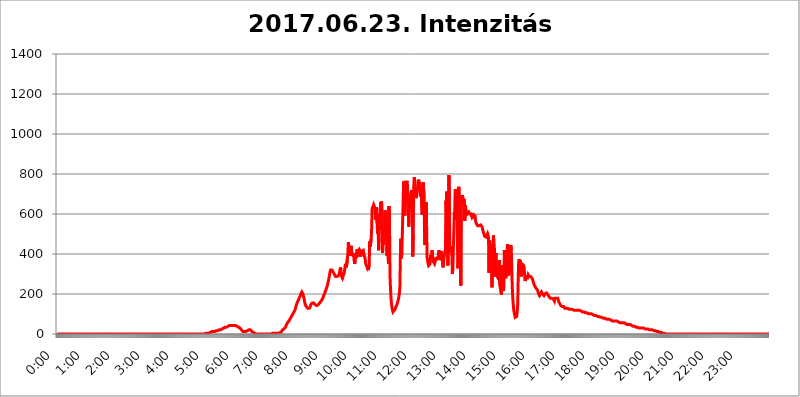
| Category | 2017.06.23. Intenzitás [W/m^2] |
|---|---|
| 0.0 | 0 |
| 0.0006944444444444445 | 0 |
| 0.001388888888888889 | 0 |
| 0.0020833333333333333 | 0 |
| 0.002777777777777778 | 0 |
| 0.003472222222222222 | 0 |
| 0.004166666666666667 | 0 |
| 0.004861111111111111 | 0 |
| 0.005555555555555556 | 0 |
| 0.0062499999999999995 | 0 |
| 0.006944444444444444 | 0 |
| 0.007638888888888889 | 0 |
| 0.008333333333333333 | 0 |
| 0.009027777777777779 | 0 |
| 0.009722222222222222 | 0 |
| 0.010416666666666666 | 0 |
| 0.011111111111111112 | 0 |
| 0.011805555555555555 | 0 |
| 0.012499999999999999 | 0 |
| 0.013194444444444444 | 0 |
| 0.013888888888888888 | 0 |
| 0.014583333333333332 | 0 |
| 0.015277777777777777 | 0 |
| 0.015972222222222224 | 0 |
| 0.016666666666666666 | 0 |
| 0.017361111111111112 | 0 |
| 0.018055555555555557 | 0 |
| 0.01875 | 0 |
| 0.019444444444444445 | 0 |
| 0.02013888888888889 | 0 |
| 0.020833333333333332 | 0 |
| 0.02152777777777778 | 0 |
| 0.022222222222222223 | 0 |
| 0.02291666666666667 | 0 |
| 0.02361111111111111 | 0 |
| 0.024305555555555556 | 0 |
| 0.024999999999999998 | 0 |
| 0.025694444444444447 | 0 |
| 0.02638888888888889 | 0 |
| 0.027083333333333334 | 0 |
| 0.027777777777777776 | 0 |
| 0.02847222222222222 | 0 |
| 0.029166666666666664 | 0 |
| 0.029861111111111113 | 0 |
| 0.030555555555555555 | 0 |
| 0.03125 | 0 |
| 0.03194444444444445 | 0 |
| 0.03263888888888889 | 0 |
| 0.03333333333333333 | 0 |
| 0.034027777777777775 | 0 |
| 0.034722222222222224 | 0 |
| 0.035416666666666666 | 0 |
| 0.036111111111111115 | 0 |
| 0.03680555555555556 | 0 |
| 0.0375 | 0 |
| 0.03819444444444444 | 0 |
| 0.03888888888888889 | 0 |
| 0.03958333333333333 | 0 |
| 0.04027777777777778 | 0 |
| 0.04097222222222222 | 0 |
| 0.041666666666666664 | 0 |
| 0.042361111111111106 | 0 |
| 0.04305555555555556 | 0 |
| 0.043750000000000004 | 0 |
| 0.044444444444444446 | 0 |
| 0.04513888888888889 | 0 |
| 0.04583333333333334 | 0 |
| 0.04652777777777778 | 0 |
| 0.04722222222222222 | 0 |
| 0.04791666666666666 | 0 |
| 0.04861111111111111 | 0 |
| 0.049305555555555554 | 0 |
| 0.049999999999999996 | 0 |
| 0.05069444444444445 | 0 |
| 0.051388888888888894 | 0 |
| 0.052083333333333336 | 0 |
| 0.05277777777777778 | 0 |
| 0.05347222222222222 | 0 |
| 0.05416666666666667 | 0 |
| 0.05486111111111111 | 0 |
| 0.05555555555555555 | 0 |
| 0.05625 | 0 |
| 0.05694444444444444 | 0 |
| 0.057638888888888885 | 0 |
| 0.05833333333333333 | 0 |
| 0.05902777777777778 | 0 |
| 0.059722222222222225 | 0 |
| 0.06041666666666667 | 0 |
| 0.061111111111111116 | 0 |
| 0.06180555555555556 | 0 |
| 0.0625 | 0 |
| 0.06319444444444444 | 0 |
| 0.06388888888888888 | 0 |
| 0.06458333333333334 | 0 |
| 0.06527777777777778 | 0 |
| 0.06597222222222222 | 0 |
| 0.06666666666666667 | 0 |
| 0.06736111111111111 | 0 |
| 0.06805555555555555 | 0 |
| 0.06874999999999999 | 0 |
| 0.06944444444444443 | 0 |
| 0.07013888888888889 | 0 |
| 0.07083333333333333 | 0 |
| 0.07152777777777779 | 0 |
| 0.07222222222222223 | 0 |
| 0.07291666666666667 | 0 |
| 0.07361111111111111 | 0 |
| 0.07430555555555556 | 0 |
| 0.075 | 0 |
| 0.07569444444444444 | 0 |
| 0.0763888888888889 | 0 |
| 0.07708333333333334 | 0 |
| 0.07777777777777778 | 0 |
| 0.07847222222222222 | 0 |
| 0.07916666666666666 | 0 |
| 0.0798611111111111 | 0 |
| 0.08055555555555556 | 0 |
| 0.08125 | 0 |
| 0.08194444444444444 | 0 |
| 0.08263888888888889 | 0 |
| 0.08333333333333333 | 0 |
| 0.08402777777777777 | 0 |
| 0.08472222222222221 | 0 |
| 0.08541666666666665 | 0 |
| 0.08611111111111112 | 0 |
| 0.08680555555555557 | 0 |
| 0.08750000000000001 | 0 |
| 0.08819444444444445 | 0 |
| 0.08888888888888889 | 0 |
| 0.08958333333333333 | 0 |
| 0.09027777777777778 | 0 |
| 0.09097222222222222 | 0 |
| 0.09166666666666667 | 0 |
| 0.09236111111111112 | 0 |
| 0.09305555555555556 | 0 |
| 0.09375 | 0 |
| 0.09444444444444444 | 0 |
| 0.09513888888888888 | 0 |
| 0.09583333333333333 | 0 |
| 0.09652777777777777 | 0 |
| 0.09722222222222222 | 0 |
| 0.09791666666666667 | 0 |
| 0.09861111111111111 | 0 |
| 0.09930555555555555 | 0 |
| 0.09999999999999999 | 0 |
| 0.10069444444444443 | 0 |
| 0.1013888888888889 | 0 |
| 0.10208333333333335 | 0 |
| 0.10277777777777779 | 0 |
| 0.10347222222222223 | 0 |
| 0.10416666666666667 | 0 |
| 0.10486111111111111 | 0 |
| 0.10555555555555556 | 0 |
| 0.10625 | 0 |
| 0.10694444444444444 | 0 |
| 0.1076388888888889 | 0 |
| 0.10833333333333334 | 0 |
| 0.10902777777777778 | 0 |
| 0.10972222222222222 | 0 |
| 0.1111111111111111 | 0 |
| 0.11180555555555556 | 0 |
| 0.11180555555555556 | 0 |
| 0.1125 | 0 |
| 0.11319444444444444 | 0 |
| 0.11388888888888889 | 0 |
| 0.11458333333333333 | 0 |
| 0.11527777777777777 | 0 |
| 0.11597222222222221 | 0 |
| 0.11666666666666665 | 0 |
| 0.1173611111111111 | 0 |
| 0.11805555555555557 | 0 |
| 0.11944444444444445 | 0 |
| 0.12013888888888889 | 0 |
| 0.12083333333333333 | 0 |
| 0.12152777777777778 | 0 |
| 0.12222222222222223 | 0 |
| 0.12291666666666667 | 0 |
| 0.12291666666666667 | 0 |
| 0.12361111111111112 | 0 |
| 0.12430555555555556 | 0 |
| 0.125 | 0 |
| 0.12569444444444444 | 0 |
| 0.12638888888888888 | 0 |
| 0.12708333333333333 | 0 |
| 0.16875 | 0 |
| 0.12847222222222224 | 0 |
| 0.12916666666666668 | 0 |
| 0.12986111111111112 | 0 |
| 0.13055555555555556 | 0 |
| 0.13125 | 0 |
| 0.13194444444444445 | 0 |
| 0.1326388888888889 | 0 |
| 0.13333333333333333 | 0 |
| 0.13402777777777777 | 0 |
| 0.13402777777777777 | 0 |
| 0.13472222222222222 | 0 |
| 0.13541666666666666 | 0 |
| 0.1361111111111111 | 0 |
| 0.13749999999999998 | 0 |
| 0.13819444444444443 | 0 |
| 0.1388888888888889 | 0 |
| 0.13958333333333334 | 0 |
| 0.14027777777777778 | 0 |
| 0.14097222222222222 | 0 |
| 0.14166666666666666 | 0 |
| 0.1423611111111111 | 0 |
| 0.14305555555555557 | 0 |
| 0.14375000000000002 | 0 |
| 0.14444444444444446 | 0 |
| 0.1451388888888889 | 0 |
| 0.1451388888888889 | 0 |
| 0.14652777777777778 | 0 |
| 0.14722222222222223 | 0 |
| 0.14791666666666667 | 0 |
| 0.1486111111111111 | 0 |
| 0.14930555555555555 | 0 |
| 0.15 | 0 |
| 0.15069444444444444 | 0 |
| 0.15138888888888888 | 0 |
| 0.15208333333333332 | 0 |
| 0.15277777777777776 | 0 |
| 0.15347222222222223 | 0 |
| 0.15416666666666667 | 0 |
| 0.15486111111111112 | 0 |
| 0.15555555555555556 | 0 |
| 0.15625 | 0 |
| 0.15694444444444444 | 0 |
| 0.15763888888888888 | 0 |
| 0.15833333333333333 | 0 |
| 0.15902777777777777 | 0 |
| 0.15972222222222224 | 0 |
| 0.16041666666666668 | 0 |
| 0.16111111111111112 | 0 |
| 0.16180555555555556 | 0 |
| 0.1625 | 0 |
| 0.16319444444444445 | 0 |
| 0.1638888888888889 | 0 |
| 0.16458333333333333 | 0 |
| 0.16527777777777777 | 0 |
| 0.16597222222222222 | 0 |
| 0.16666666666666666 | 0 |
| 0.1673611111111111 | 0 |
| 0.16805555555555554 | 0 |
| 0.16874999999999998 | 0 |
| 0.16944444444444443 | 0 |
| 0.17013888888888887 | 0 |
| 0.1708333333333333 | 0 |
| 0.17152777777777775 | 0 |
| 0.17222222222222225 | 0 |
| 0.1729166666666667 | 0 |
| 0.17361111111111113 | 0 |
| 0.17430555555555557 | 0 |
| 0.17500000000000002 | 0 |
| 0.17569444444444446 | 0 |
| 0.1763888888888889 | 0 |
| 0.17708333333333334 | 0 |
| 0.17777777777777778 | 0 |
| 0.17847222222222223 | 0 |
| 0.17916666666666667 | 0 |
| 0.1798611111111111 | 0 |
| 0.18055555555555555 | 0 |
| 0.18125 | 0 |
| 0.18194444444444444 | 0 |
| 0.1826388888888889 | 0 |
| 0.18333333333333335 | 0 |
| 0.1840277777777778 | 0 |
| 0.18472222222222223 | 0 |
| 0.18541666666666667 | 0 |
| 0.18611111111111112 | 0 |
| 0.18680555555555556 | 0 |
| 0.1875 | 0 |
| 0.18819444444444444 | 0 |
| 0.18888888888888888 | 0 |
| 0.18958333333333333 | 0 |
| 0.19027777777777777 | 0 |
| 0.1909722222222222 | 0 |
| 0.19166666666666665 | 0 |
| 0.19236111111111112 | 0 |
| 0.19305555555555554 | 0 |
| 0.19375 | 0 |
| 0.19444444444444445 | 0 |
| 0.1951388888888889 | 0 |
| 0.19583333333333333 | 0 |
| 0.19652777777777777 | 0 |
| 0.19722222222222222 | 0 |
| 0.19791666666666666 | 0 |
| 0.1986111111111111 | 0 |
| 0.19930555555555554 | 0 |
| 0.19999999999999998 | 0 |
| 0.20069444444444443 | 0 |
| 0.20138888888888887 | 0 |
| 0.2020833333333333 | 0 |
| 0.2027777777777778 | 0 |
| 0.2034722222222222 | 0 |
| 0.2041666666666667 | 0 |
| 0.20486111111111113 | 0 |
| 0.20555555555555557 | 0 |
| 0.20625000000000002 | 0 |
| 0.20694444444444446 | 3.525 |
| 0.2076388888888889 | 3.525 |
| 0.20833333333333334 | 3.525 |
| 0.20902777777777778 | 3.525 |
| 0.20972222222222223 | 3.525 |
| 0.21041666666666667 | 3.525 |
| 0.2111111111111111 | 3.525 |
| 0.21180555555555555 | 3.525 |
| 0.2125 | 3.525 |
| 0.21319444444444444 | 7.887 |
| 0.2138888888888889 | 7.887 |
| 0.21458333333333335 | 7.887 |
| 0.2152777777777778 | 7.887 |
| 0.21597222222222223 | 7.887 |
| 0.21666666666666667 | 12.257 |
| 0.21736111111111112 | 12.257 |
| 0.21805555555555556 | 12.257 |
| 0.21875 | 12.257 |
| 0.21944444444444444 | 12.257 |
| 0.22013888888888888 | 12.257 |
| 0.22083333333333333 | 12.257 |
| 0.22152777777777777 | 16.636 |
| 0.2222222222222222 | 16.636 |
| 0.22291666666666665 | 16.636 |
| 0.2236111111111111 | 16.636 |
| 0.22430555555555556 | 16.636 |
| 0.225 | 16.636 |
| 0.22569444444444445 | 16.636 |
| 0.2263888888888889 | 21.024 |
| 0.22708333333333333 | 21.024 |
| 0.22777777777777777 | 21.024 |
| 0.22847222222222222 | 21.024 |
| 0.22916666666666666 | 21.024 |
| 0.2298611111111111 | 25.419 |
| 0.23055555555555554 | 25.419 |
| 0.23124999999999998 | 25.419 |
| 0.23194444444444443 | 29.823 |
| 0.23263888888888887 | 29.823 |
| 0.2333333333333333 | 29.823 |
| 0.2340277777777778 | 29.823 |
| 0.2347222222222222 | 29.823 |
| 0.2354166666666667 | 34.234 |
| 0.23611111111111113 | 34.234 |
| 0.23680555555555557 | 34.234 |
| 0.23750000000000002 | 34.234 |
| 0.23819444444444446 | 38.653 |
| 0.2388888888888889 | 38.653 |
| 0.23958333333333334 | 38.653 |
| 0.24027777777777778 | 38.653 |
| 0.24097222222222223 | 38.653 |
| 0.24166666666666667 | 43.079 |
| 0.2423611111111111 | 43.079 |
| 0.24305555555555555 | 43.079 |
| 0.24375 | 43.079 |
| 0.24444444444444446 | 43.079 |
| 0.24513888888888888 | 43.079 |
| 0.24583333333333335 | 43.079 |
| 0.2465277777777778 | 43.079 |
| 0.24722222222222223 | 43.079 |
| 0.24791666666666667 | 43.079 |
| 0.24861111111111112 | 43.079 |
| 0.24930555555555556 | 43.079 |
| 0.25 | 43.079 |
| 0.25069444444444444 | 43.079 |
| 0.2513888888888889 | 38.653 |
| 0.2520833333333333 | 38.653 |
| 0.25277777777777777 | 38.653 |
| 0.2534722222222222 | 34.234 |
| 0.25416666666666665 | 34.234 |
| 0.2548611111111111 | 34.234 |
| 0.2555555555555556 | 29.823 |
| 0.25625000000000003 | 29.823 |
| 0.2569444444444445 | 29.823 |
| 0.2576388888888889 | 25.419 |
| 0.25833333333333336 | 21.024 |
| 0.2590277777777778 | 21.024 |
| 0.25972222222222224 | 16.636 |
| 0.2604166666666667 | 12.257 |
| 0.2611111111111111 | 12.257 |
| 0.26180555555555557 | 12.257 |
| 0.2625 | 12.257 |
| 0.26319444444444445 | 12.257 |
| 0.2638888888888889 | 12.257 |
| 0.26458333333333334 | 12.257 |
| 0.2652777777777778 | 12.257 |
| 0.2659722222222222 | 12.257 |
| 0.26666666666666666 | 16.636 |
| 0.2673611111111111 | 16.636 |
| 0.26805555555555555 | 21.024 |
| 0.26875 | 21.024 |
| 0.26944444444444443 | 21.024 |
| 0.2701388888888889 | 21.024 |
| 0.2708333333333333 | 21.024 |
| 0.27152777777777776 | 21.024 |
| 0.2722222222222222 | 16.636 |
| 0.27291666666666664 | 12.257 |
| 0.2736111111111111 | 12.257 |
| 0.2743055555555555 | 12.257 |
| 0.27499999999999997 | 7.887 |
| 0.27569444444444446 | 3.525 |
| 0.27638888888888885 | 3.525 |
| 0.27708333333333335 | 3.525 |
| 0.2777777777777778 | 3.525 |
| 0.27847222222222223 | 0 |
| 0.2791666666666667 | 0 |
| 0.2798611111111111 | 0 |
| 0.28055555555555556 | 0 |
| 0.28125 | 0 |
| 0.28194444444444444 | 0 |
| 0.2826388888888889 | 0 |
| 0.2833333333333333 | 0 |
| 0.28402777777777777 | 0 |
| 0.2847222222222222 | 0 |
| 0.28541666666666665 | 0 |
| 0.28611111111111115 | 0 |
| 0.28680555555555554 | 0 |
| 0.28750000000000003 | 0 |
| 0.2881944444444445 | 0 |
| 0.2888888888888889 | 0 |
| 0.28958333333333336 | 0 |
| 0.2902777777777778 | 0 |
| 0.29097222222222224 | 0 |
| 0.2916666666666667 | 0 |
| 0.2923611111111111 | 0 |
| 0.29305555555555557 | 0 |
| 0.29375 | 0 |
| 0.29444444444444445 | 0 |
| 0.2951388888888889 | 0 |
| 0.29583333333333334 | 0 |
| 0.2965277777777778 | 0 |
| 0.2972222222222222 | 0 |
| 0.29791666666666666 | 0 |
| 0.2986111111111111 | 0 |
| 0.29930555555555555 | 0 |
| 0.3 | 0 |
| 0.30069444444444443 | 3.525 |
| 0.3013888888888889 | 3.525 |
| 0.3020833333333333 | 3.525 |
| 0.30277777777777776 | 3.525 |
| 0.3034722222222222 | 0 |
| 0.30416666666666664 | 3.525 |
| 0.3048611111111111 | 3.525 |
| 0.3055555555555555 | 3.525 |
| 0.30624999999999997 | 3.525 |
| 0.3069444444444444 | 3.525 |
| 0.3076388888888889 | 3.525 |
| 0.30833333333333335 | 3.525 |
| 0.3090277777777778 | 3.525 |
| 0.30972222222222223 | 3.525 |
| 0.3104166666666667 | 3.525 |
| 0.3111111111111111 | 3.525 |
| 0.31180555555555556 | 7.887 |
| 0.3125 | 7.887 |
| 0.31319444444444444 | 12.257 |
| 0.3138888888888889 | 12.257 |
| 0.3145833333333333 | 12.257 |
| 0.31527777777777777 | 16.636 |
| 0.3159722222222222 | 21.024 |
| 0.31666666666666665 | 21.024 |
| 0.31736111111111115 | 25.419 |
| 0.31805555555555554 | 25.419 |
| 0.31875000000000003 | 29.823 |
| 0.3194444444444445 | 29.823 |
| 0.3201388888888889 | 34.234 |
| 0.32083333333333336 | 38.653 |
| 0.3215277777777778 | 47.511 |
| 0.32222222222222224 | 51.951 |
| 0.3229166666666667 | 56.398 |
| 0.3236111111111111 | 56.398 |
| 0.32430555555555557 | 60.85 |
| 0.325 | 65.31 |
| 0.32569444444444445 | 69.775 |
| 0.3263888888888889 | 74.246 |
| 0.32708333333333334 | 78.722 |
| 0.3277777777777778 | 83.205 |
| 0.3284722222222222 | 87.692 |
| 0.32916666666666666 | 92.184 |
| 0.3298611111111111 | 96.682 |
| 0.33055555555555555 | 101.184 |
| 0.33125 | 105.69 |
| 0.33194444444444443 | 110.201 |
| 0.3326388888888889 | 114.716 |
| 0.3333333333333333 | 119.235 |
| 0.3340277777777778 | 128.284 |
| 0.3347222222222222 | 137.347 |
| 0.3354166666666667 | 146.423 |
| 0.3361111111111111 | 150.964 |
| 0.3368055555555556 | 160.056 |
| 0.33749999999999997 | 164.605 |
| 0.33819444444444446 | 169.156 |
| 0.33888888888888885 | 173.709 |
| 0.33958333333333335 | 182.82 |
| 0.34027777777777773 | 187.378 |
| 0.34097222222222223 | 191.937 |
| 0.3416666666666666 | 201.058 |
| 0.3423611111111111 | 205.62 |
| 0.3430555555555555 | 210.182 |
| 0.34375 | 210.182 |
| 0.3444444444444445 | 201.058 |
| 0.3451388888888889 | 191.937 |
| 0.3458333333333334 | 182.82 |
| 0.34652777777777777 | 169.156 |
| 0.34722222222222227 | 155.509 |
| 0.34791666666666665 | 146.423 |
| 0.34861111111111115 | 141.884 |
| 0.34930555555555554 | 137.347 |
| 0.35000000000000003 | 132.814 |
| 0.3506944444444444 | 132.814 |
| 0.3513888888888889 | 128.284 |
| 0.3520833333333333 | 128.284 |
| 0.3527777777777778 | 128.284 |
| 0.3534722222222222 | 128.284 |
| 0.3541666666666667 | 132.814 |
| 0.3548611111111111 | 137.347 |
| 0.35555555555555557 | 146.423 |
| 0.35625 | 150.964 |
| 0.35694444444444445 | 150.964 |
| 0.3576388888888889 | 155.509 |
| 0.35833333333333334 | 155.509 |
| 0.3590277777777778 | 155.509 |
| 0.3597222222222222 | 155.509 |
| 0.36041666666666666 | 150.964 |
| 0.3611111111111111 | 150.964 |
| 0.36180555555555555 | 146.423 |
| 0.3625 | 146.423 |
| 0.36319444444444443 | 141.884 |
| 0.3638888888888889 | 141.884 |
| 0.3645833333333333 | 141.884 |
| 0.3652777777777778 | 141.884 |
| 0.3659722222222222 | 146.423 |
| 0.3666666666666667 | 146.423 |
| 0.3673611111111111 | 150.964 |
| 0.3680555555555556 | 155.509 |
| 0.36874999999999997 | 155.509 |
| 0.36944444444444446 | 160.056 |
| 0.37013888888888885 | 164.605 |
| 0.37083333333333335 | 169.156 |
| 0.37152777777777773 | 173.709 |
| 0.37222222222222223 | 178.264 |
| 0.3729166666666666 | 182.82 |
| 0.3736111111111111 | 191.937 |
| 0.3743055555555555 | 191.937 |
| 0.375 | 201.058 |
| 0.3756944444444445 | 210.182 |
| 0.3763888888888889 | 214.746 |
| 0.3770833333333334 | 223.873 |
| 0.37777777777777777 | 228.436 |
| 0.37847222222222227 | 237.564 |
| 0.37916666666666665 | 246.689 |
| 0.37986111111111115 | 260.373 |
| 0.38055555555555554 | 269.49 |
| 0.38125000000000003 | 283.156 |
| 0.3819444444444444 | 296.808 |
| 0.3826388888888889 | 310.44 |
| 0.3833333333333333 | 319.517 |
| 0.3840277777777778 | 314.98 |
| 0.3847222222222222 | 314.98 |
| 0.3854166666666667 | 319.517 |
| 0.3861111111111111 | 314.98 |
| 0.38680555555555557 | 310.44 |
| 0.3875 | 305.898 |
| 0.38819444444444445 | 301.354 |
| 0.3888888888888889 | 296.808 |
| 0.38958333333333334 | 296.808 |
| 0.3902777777777778 | 287.709 |
| 0.3909722222222222 | 287.709 |
| 0.39166666666666666 | 287.709 |
| 0.3923611111111111 | 287.709 |
| 0.39305555555555555 | 283.156 |
| 0.39375 | 287.709 |
| 0.39444444444444443 | 292.259 |
| 0.3951388888888889 | 296.808 |
| 0.3958333333333333 | 305.898 |
| 0.3965277777777778 | 319.517 |
| 0.3972222222222222 | 333.113 |
| 0.3979166666666667 | 319.517 |
| 0.3986111111111111 | 287.709 |
| 0.3993055555555556 | 287.709 |
| 0.39999999999999997 | 278.603 |
| 0.40069444444444446 | 287.709 |
| 0.40138888888888885 | 283.156 |
| 0.40208333333333335 | 301.354 |
| 0.40277777777777773 | 310.44 |
| 0.40347222222222223 | 333.113 |
| 0.4041666666666666 | 351.198 |
| 0.4048611111111111 | 342.162 |
| 0.4055555555555555 | 333.113 |
| 0.40625 | 333.113 |
| 0.4069444444444445 | 378.224 |
| 0.4076388888888889 | 405.108 |
| 0.4083333333333334 | 458.38 |
| 0.40902777777777777 | 462.786 |
| 0.40972222222222227 | 418.492 |
| 0.41041666666666665 | 391.685 |
| 0.41111111111111115 | 387.202 |
| 0.41180555555555554 | 422.943 |
| 0.41250000000000003 | 440.702 |
| 0.4131944444444444 | 391.685 |
| 0.4138888888888889 | 405.108 |
| 0.4145833333333333 | 396.164 |
| 0.4152777777777778 | 387.202 |
| 0.4159722222222222 | 405.108 |
| 0.4166666666666667 | 364.728 |
| 0.4173611111111111 | 351.198 |
| 0.41805555555555557 | 400.638 |
| 0.41875 | 378.224 |
| 0.41944444444444445 | 382.715 |
| 0.4201388888888889 | 373.729 |
| 0.42083333333333334 | 422.943 |
| 0.4215277777777778 | 387.202 |
| 0.4222222222222222 | 414.035 |
| 0.42291666666666666 | 409.574 |
| 0.4236111111111111 | 422.943 |
| 0.42430555555555555 | 418.492 |
| 0.425 | 414.035 |
| 0.42569444444444443 | 387.202 |
| 0.4263888888888889 | 400.638 |
| 0.4270833333333333 | 414.035 |
| 0.4277777777777778 | 409.574 |
| 0.4284722222222222 | 409.574 |
| 0.4291666666666667 | 418.492 |
| 0.4298611111111111 | 405.108 |
| 0.4305555555555556 | 409.574 |
| 0.43124999999999997 | 405.108 |
| 0.43194444444444446 | 373.729 |
| 0.43263888888888885 | 351.198 |
| 0.43333333333333335 | 351.198 |
| 0.43402777777777773 | 355.712 |
| 0.43472222222222223 | 333.113 |
| 0.4354166666666666 | 342.162 |
| 0.4361111111111111 | 319.517 |
| 0.4368055555555555 | 314.98 |
| 0.4375 | 342.162 |
| 0.4381944444444445 | 462.786 |
| 0.4388888888888889 | 436.27 |
| 0.4395833333333334 | 436.27 |
| 0.44027777777777777 | 475.972 |
| 0.44097222222222227 | 528.2 |
| 0.44166666666666665 | 629.948 |
| 0.44236111111111115 | 634.105 |
| 0.44305555555555554 | 638.256 |
| 0.44375000000000003 | 646.537 |
| 0.4444444444444444 | 642.4 |
| 0.4451388888888889 | 634.105 |
| 0.4458333333333333 | 625.784 |
| 0.4465277777777778 | 571.049 |
| 0.4472222222222222 | 625.784 |
| 0.4479166666666667 | 634.105 |
| 0.4486111111111111 | 553.986 |
| 0.44930555555555557 | 502.192 |
| 0.45 | 600.661 |
| 0.45069444444444445 | 418.492 |
| 0.4513888888888889 | 484.735 |
| 0.45208333333333334 | 575.299 |
| 0.4527777777777778 | 523.88 |
| 0.4534722222222222 | 658.909 |
| 0.45416666666666666 | 600.661 |
| 0.4548611111111111 | 663.019 |
| 0.45555555555555555 | 575.299 |
| 0.45625 | 405.108 |
| 0.45694444444444443 | 467.187 |
| 0.4576388888888889 | 445.129 |
| 0.4583333333333333 | 528.2 |
| 0.4590277777777778 | 506.542 |
| 0.4597222222222222 | 617.436 |
| 0.4604166666666667 | 613.252 |
| 0.4611111111111111 | 596.45 |
| 0.4618055555555556 | 596.45 |
| 0.46249999999999997 | 391.685 |
| 0.46319444444444446 | 566.793 |
| 0.46388888888888885 | 391.685 |
| 0.46458333333333335 | 351.198 |
| 0.46527777777777773 | 638.256 |
| 0.46597222222222223 | 566.793 |
| 0.4666666666666666 | 296.808 |
| 0.4673611111111111 | 228.436 |
| 0.4680555555555555 | 182.82 |
| 0.46875 | 150.964 |
| 0.4694444444444445 | 132.814 |
| 0.4701388888888889 | 119.235 |
| 0.4708333333333334 | 110.201 |
| 0.47152777777777777 | 110.201 |
| 0.47222222222222227 | 114.716 |
| 0.47291666666666665 | 119.235 |
| 0.47361111111111115 | 123.758 |
| 0.47430555555555554 | 128.284 |
| 0.47500000000000003 | 137.347 |
| 0.4756944444444444 | 141.884 |
| 0.4763888888888889 | 146.423 |
| 0.4770833333333333 | 155.509 |
| 0.4777777777777778 | 164.605 |
| 0.4784722222222222 | 173.709 |
| 0.4791666666666667 | 187.378 |
| 0.4798611111111111 | 205.62 |
| 0.48055555555555557 | 237.564 |
| 0.48125 | 396.164 |
| 0.48194444444444445 | 475.972 |
| 0.4826388888888889 | 378.224 |
| 0.48333333333333334 | 409.574 |
| 0.4840277777777778 | 502.192 |
| 0.4847222222222222 | 609.062 |
| 0.48541666666666666 | 707.8 |
| 0.4861111111111111 | 763.674 |
| 0.48680555555555555 | 759.723 |
| 0.4875 | 592.233 |
| 0.48819444444444443 | 743.859 |
| 0.4888888888888889 | 759.723 |
| 0.4895833333333333 | 759.723 |
| 0.4902777777777778 | 755.766 |
| 0.4909722222222222 | 759.723 |
| 0.4916666666666667 | 683.473 |
| 0.4923611111111111 | 629.948 |
| 0.4930555555555556 | 536.82 |
| 0.49374999999999997 | 642.4 |
| 0.49444444444444446 | 625.784 |
| 0.49513888888888885 | 675.311 |
| 0.49583333333333335 | 703.762 |
| 0.49652777777777773 | 699.717 |
| 0.49722222222222223 | 719.877 |
| 0.4979166666666666 | 691.608 |
| 0.4986111111111111 | 387.202 |
| 0.4993055555555555 | 497.836 |
| 0.5 | 735.89 |
| 0.5006944444444444 | 783.342 |
| 0.5013888888888889 | 767.62 |
| 0.5020833333333333 | 707.8 |
| 0.5027777777777778 | 691.608 |
| 0.5034722222222222 | 679.395 |
| 0.5041666666666667 | 695.666 |
| 0.5048611111111111 | 707.8 |
| 0.5055555555555555 | 711.832 |
| 0.50625 | 763.674 |
| 0.5069444444444444 | 771.559 |
| 0.5076388888888889 | 747.834 |
| 0.5083333333333333 | 755.766 |
| 0.5090277777777777 | 727.896 |
| 0.5097222222222222 | 687.544 |
| 0.5104166666666666 | 731.896 |
| 0.5111111111111112 | 650.667 |
| 0.5118055555555555 | 596.45 |
| 0.5125000000000001 | 743.859 |
| 0.5131944444444444 | 759.723 |
| 0.513888888888889 | 759.723 |
| 0.5145833333333333 | 683.473 |
| 0.5152777777777778 | 453.968 |
| 0.5159722222222222 | 445.129 |
| 0.5166666666666667 | 510.885 |
| 0.517361111111111 | 658.909 |
| 0.5180555555555556 | 541.121 |
| 0.5187499999999999 | 382.715 |
| 0.5194444444444445 | 369.23 |
| 0.5201388888888888 | 351.198 |
| 0.5208333333333334 | 342.162 |
| 0.5215277777777778 | 346.682 |
| 0.5222222222222223 | 342.162 |
| 0.5229166666666667 | 351.198 |
| 0.5236111111111111 | 396.164 |
| 0.5243055555555556 | 378.224 |
| 0.525 | 391.685 |
| 0.5256944444444445 | 418.492 |
| 0.5263888888888889 | 391.685 |
| 0.5270833333333333 | 364.728 |
| 0.5277777777777778 | 364.728 |
| 0.5284722222222222 | 364.728 |
| 0.5291666666666667 | 351.198 |
| 0.5298611111111111 | 360.221 |
| 0.5305555555555556 | 369.23 |
| 0.53125 | 382.715 |
| 0.5319444444444444 | 369.23 |
| 0.5326388888888889 | 378.224 |
| 0.5333333333333333 | 373.729 |
| 0.5340277777777778 | 387.202 |
| 0.5347222222222222 | 378.224 |
| 0.5354166666666667 | 418.492 |
| 0.5361111111111111 | 396.164 |
| 0.5368055555555555 | 369.23 |
| 0.5375 | 396.164 |
| 0.5381944444444444 | 405.108 |
| 0.5388888888888889 | 414.035 |
| 0.5395833333333333 | 387.202 |
| 0.5402777777777777 | 360.221 |
| 0.5409722222222222 | 333.113 |
| 0.5416666666666666 | 355.712 |
| 0.5423611111111112 | 378.224 |
| 0.5430555555555555 | 378.224 |
| 0.5437500000000001 | 409.574 |
| 0.5444444444444444 | 422.943 |
| 0.545138888888889 | 667.123 |
| 0.5458333333333333 | 604.864 |
| 0.5465277777777778 | 711.832 |
| 0.5472222222222222 | 549.704 |
| 0.5479166666666667 | 342.162 |
| 0.548611111111111 | 579.542 |
| 0.5493055555555556 | 795.074 |
| 0.5499999999999999 | 667.123 |
| 0.5506944444444445 | 409.574 |
| 0.5513888888888888 | 414.035 |
| 0.5520833333333334 | 405.108 |
| 0.5527777777777778 | 422.943 |
| 0.5534722222222223 | 391.685 |
| 0.5541666666666667 | 301.354 |
| 0.5548611111111111 | 328.584 |
| 0.5555555555555556 | 422.943 |
| 0.55625 | 427.39 |
| 0.5569444444444445 | 609.062 |
| 0.5576388888888889 | 571.049 |
| 0.5583333333333333 | 723.889 |
| 0.5590277777777778 | 727.896 |
| 0.5597222222222222 | 727.896 |
| 0.5604166666666667 | 699.717 |
| 0.5611111111111111 | 703.762 |
| 0.5618055555555556 | 328.584 |
| 0.5625 | 364.728 |
| 0.5631944444444444 | 735.89 |
| 0.5638888888888889 | 731.896 |
| 0.5645833333333333 | 523.88 |
| 0.5652777777777778 | 571.049 |
| 0.5659722222222222 | 242.127 |
| 0.5666666666666667 | 687.544 |
| 0.5673611111111111 | 687.544 |
| 0.5680555555555555 | 691.608 |
| 0.56875 | 687.544 |
| 0.5694444444444444 | 683.473 |
| 0.5701388888888889 | 667.123 |
| 0.5708333333333333 | 675.311 |
| 0.5715277777777777 | 566.793 |
| 0.5722222222222222 | 642.4 |
| 0.5729166666666666 | 625.784 |
| 0.5736111111111112 | 617.436 |
| 0.5743055555555555 | 617.436 |
| 0.5750000000000001 | 600.661 |
| 0.5756944444444444 | 604.864 |
| 0.576388888888889 | 600.661 |
| 0.5770833333333333 | 609.062 |
| 0.5777777777777778 | 600.661 |
| 0.5784722222222222 | 600.661 |
| 0.5791666666666667 | 600.661 |
| 0.579861111111111 | 600.661 |
| 0.5805555555555556 | 596.45 |
| 0.5812499999999999 | 588.009 |
| 0.5819444444444445 | 592.233 |
| 0.5826388888888888 | 604.864 |
| 0.5833333333333334 | 600.661 |
| 0.5840277777777778 | 583.779 |
| 0.5847222222222223 | 579.542 |
| 0.5854166666666667 | 579.542 |
| 0.5861111111111111 | 588.009 |
| 0.5868055555555556 | 562.53 |
| 0.5875 | 553.986 |
| 0.5881944444444445 | 558.261 |
| 0.5888888888888889 | 549.704 |
| 0.5895833333333333 | 541.121 |
| 0.5902777777777778 | 541.121 |
| 0.5909722222222222 | 541.121 |
| 0.5916666666666667 | 541.121 |
| 0.5923611111111111 | 536.82 |
| 0.5930555555555556 | 541.121 |
| 0.59375 | 545.416 |
| 0.5944444444444444 | 545.416 |
| 0.5951388888888889 | 549.704 |
| 0.5958333333333333 | 536.82 |
| 0.5965277777777778 | 523.88 |
| 0.5972222222222222 | 523.88 |
| 0.5979166666666667 | 506.542 |
| 0.5986111111111111 | 497.836 |
| 0.5993055555555555 | 489.108 |
| 0.6 | 489.108 |
| 0.6006944444444444 | 484.735 |
| 0.6013888888888889 | 484.735 |
| 0.6020833333333333 | 484.735 |
| 0.6027777777777777 | 484.735 |
| 0.6034722222222222 | 502.192 |
| 0.6041666666666666 | 493.475 |
| 0.6048611111111112 | 484.735 |
| 0.6055555555555555 | 305.898 |
| 0.6062500000000001 | 467.187 |
| 0.6069444444444444 | 360.221 |
| 0.607638888888889 | 449.551 |
| 0.6083333333333333 | 427.39 |
| 0.6090277777777778 | 422.943 |
| 0.6097222222222222 | 233 |
| 0.6104166666666667 | 228.436 |
| 0.611111111111111 | 458.38 |
| 0.6118055555555556 | 493.475 |
| 0.6124999999999999 | 440.702 |
| 0.6131944444444445 | 427.39 |
| 0.6138888888888888 | 287.709 |
| 0.6145833333333334 | 314.98 |
| 0.6152777777777778 | 405.108 |
| 0.6159722222222223 | 324.052 |
| 0.6166666666666667 | 310.44 |
| 0.6173611111111111 | 324.052 |
| 0.6180555555555556 | 278.603 |
| 0.61875 | 310.44 |
| 0.6194444444444445 | 269.49 |
| 0.6201388888888889 | 369.23 |
| 0.6208333333333333 | 242.127 |
| 0.6215277777777778 | 246.689 |
| 0.6222222222222222 | 210.182 |
| 0.6229166666666667 | 196.497 |
| 0.6236111111111111 | 201.058 |
| 0.6243055555555556 | 342.162 |
| 0.625 | 260.373 |
| 0.6256944444444444 | 214.746 |
| 0.6263888888888889 | 242.127 |
| 0.6270833333333333 | 418.492 |
| 0.6277777777777778 | 314.98 |
| 0.6284722222222222 | 301.354 |
| 0.6291666666666667 | 278.603 |
| 0.6298611111111111 | 333.113 |
| 0.6305555555555555 | 337.639 |
| 0.63125 | 436.27 |
| 0.6319444444444444 | 449.551 |
| 0.6326388888888889 | 314.98 |
| 0.6333333333333333 | 292.259 |
| 0.6340277777777777 | 337.639 |
| 0.6347222222222222 | 324.052 |
| 0.6354166666666666 | 387.202 |
| 0.6361111111111112 | 445.129 |
| 0.6368055555555555 | 418.492 |
| 0.6375000000000001 | 414.035 |
| 0.6381944444444444 | 233 |
| 0.638888888888889 | 178.264 |
| 0.6395833333333333 | 146.423 |
| 0.6402777777777778 | 119.235 |
| 0.6409722222222222 | 105.69 |
| 0.6416666666666667 | 92.184 |
| 0.642361111111111 | 83.205 |
| 0.6430555555555556 | 83.205 |
| 0.6437499999999999 | 83.205 |
| 0.6444444444444445 | 87.692 |
| 0.6451388888888888 | 110.201 |
| 0.6458333333333334 | 150.964 |
| 0.6465277777777778 | 283.156 |
| 0.6472222222222223 | 360.221 |
| 0.6479166666666667 | 373.729 |
| 0.6486111111111111 | 360.221 |
| 0.6493055555555556 | 369.23 |
| 0.65 | 305.898 |
| 0.6506944444444445 | 287.709 |
| 0.6513888888888889 | 351.198 |
| 0.6520833333333333 | 346.682 |
| 0.6527777777777778 | 346.682 |
| 0.6534722222222222 | 346.682 |
| 0.6541666666666667 | 342.162 |
| 0.6548611111111111 | 333.113 |
| 0.6555555555555556 | 292.259 |
| 0.65625 | 264.932 |
| 0.6569444444444444 | 278.603 |
| 0.6576388888888889 | 292.259 |
| 0.6583333333333333 | 292.259 |
| 0.6590277777777778 | 274.047 |
| 0.6597222222222222 | 287.709 |
| 0.6604166666666667 | 296.808 |
| 0.6611111111111111 | 292.259 |
| 0.6618055555555555 | 287.709 |
| 0.6625 | 287.709 |
| 0.6631944444444444 | 287.709 |
| 0.6638888888888889 | 287.709 |
| 0.6645833333333333 | 287.709 |
| 0.6652777777777777 | 283.156 |
| 0.6659722222222222 | 278.603 |
| 0.6666666666666666 | 274.047 |
| 0.6673611111111111 | 264.932 |
| 0.6680555555555556 | 255.813 |
| 0.6687500000000001 | 246.689 |
| 0.6694444444444444 | 242.127 |
| 0.6701388888888888 | 237.564 |
| 0.6708333333333334 | 233 |
| 0.6715277777777778 | 228.436 |
| 0.6722222222222222 | 228.436 |
| 0.6729166666666666 | 223.873 |
| 0.6736111111111112 | 219.309 |
| 0.6743055555555556 | 210.182 |
| 0.6749999999999999 | 201.058 |
| 0.6756944444444444 | 196.497 |
| 0.6763888888888889 | 191.937 |
| 0.6770833333333334 | 191.937 |
| 0.6777777777777777 | 201.058 |
| 0.6784722222222223 | 205.62 |
| 0.6791666666666667 | 210.182 |
| 0.6798611111111111 | 205.62 |
| 0.6805555555555555 | 201.058 |
| 0.68125 | 201.058 |
| 0.6819444444444445 | 196.497 |
| 0.6826388888888889 | 191.937 |
| 0.6833333333333332 | 196.497 |
| 0.6840277777777778 | 201.058 |
| 0.6847222222222222 | 205.62 |
| 0.6854166666666667 | 205.62 |
| 0.686111111111111 | 205.62 |
| 0.6868055555555556 | 205.62 |
| 0.6875 | 201.058 |
| 0.6881944444444444 | 196.497 |
| 0.688888888888889 | 191.937 |
| 0.6895833333333333 | 187.378 |
| 0.6902777777777778 | 182.82 |
| 0.6909722222222222 | 182.82 |
| 0.6916666666666668 | 178.264 |
| 0.6923611111111111 | 178.264 |
| 0.6930555555555555 | 178.264 |
| 0.69375 | 178.264 |
| 0.6944444444444445 | 178.264 |
| 0.6951388888888889 | 178.264 |
| 0.6958333333333333 | 173.709 |
| 0.6965277777777777 | 169.156 |
| 0.6972222222222223 | 164.605 |
| 0.6979166666666666 | 178.264 |
| 0.6986111111111111 | 178.264 |
| 0.6993055555555556 | 178.264 |
| 0.7000000000000001 | 178.264 |
| 0.7006944444444444 | 182.82 |
| 0.7013888888888888 | 182.82 |
| 0.7020833333333334 | 178.264 |
| 0.7027777777777778 | 169.156 |
| 0.7034722222222222 | 160.056 |
| 0.7041666666666666 | 155.509 |
| 0.7048611111111112 | 150.964 |
| 0.7055555555555556 | 150.964 |
| 0.7062499999999999 | 141.884 |
| 0.7069444444444444 | 137.347 |
| 0.7076388888888889 | 137.347 |
| 0.7083333333333334 | 137.347 |
| 0.7090277777777777 | 137.347 |
| 0.7097222222222223 | 137.347 |
| 0.7104166666666667 | 137.347 |
| 0.7111111111111111 | 132.814 |
| 0.7118055555555555 | 128.284 |
| 0.7125 | 128.284 |
| 0.7131944444444445 | 128.284 |
| 0.7138888888888889 | 128.284 |
| 0.7145833333333332 | 128.284 |
| 0.7152777777777778 | 128.284 |
| 0.7159722222222222 | 128.284 |
| 0.7166666666666667 | 128.284 |
| 0.717361111111111 | 128.284 |
| 0.7180555555555556 | 123.758 |
| 0.71875 | 123.758 |
| 0.7194444444444444 | 123.758 |
| 0.720138888888889 | 123.758 |
| 0.7208333333333333 | 123.758 |
| 0.7215277777777778 | 123.758 |
| 0.7222222222222222 | 123.758 |
| 0.7229166666666668 | 119.235 |
| 0.7236111111111111 | 119.235 |
| 0.7243055555555555 | 119.235 |
| 0.725 | 119.235 |
| 0.7256944444444445 | 119.235 |
| 0.7263888888888889 | 119.235 |
| 0.7270833333333333 | 119.235 |
| 0.7277777777777777 | 119.235 |
| 0.7284722222222223 | 119.235 |
| 0.7291666666666666 | 119.235 |
| 0.7298611111111111 | 119.235 |
| 0.7305555555555556 | 119.235 |
| 0.7312500000000001 | 119.235 |
| 0.7319444444444444 | 119.235 |
| 0.7326388888888888 | 119.235 |
| 0.7333333333333334 | 114.716 |
| 0.7340277777777778 | 114.716 |
| 0.7347222222222222 | 114.716 |
| 0.7354166666666666 | 114.716 |
| 0.7361111111111112 | 110.201 |
| 0.7368055555555556 | 110.201 |
| 0.7374999999999999 | 110.201 |
| 0.7381944444444444 | 110.201 |
| 0.7388888888888889 | 110.201 |
| 0.7395833333333334 | 110.201 |
| 0.7402777777777777 | 110.201 |
| 0.7409722222222223 | 105.69 |
| 0.7416666666666667 | 105.69 |
| 0.7423611111111111 | 105.69 |
| 0.7430555555555555 | 105.69 |
| 0.74375 | 105.69 |
| 0.7444444444444445 | 101.184 |
| 0.7451388888888889 | 101.184 |
| 0.7458333333333332 | 101.184 |
| 0.7465277777777778 | 101.184 |
| 0.7472222222222222 | 101.184 |
| 0.7479166666666667 | 101.184 |
| 0.748611111111111 | 101.184 |
| 0.7493055555555556 | 101.184 |
| 0.75 | 101.184 |
| 0.7506944444444444 | 96.682 |
| 0.751388888888889 | 96.682 |
| 0.7520833333333333 | 96.682 |
| 0.7527777777777778 | 96.682 |
| 0.7534722222222222 | 92.184 |
| 0.7541666666666668 | 92.184 |
| 0.7548611111111111 | 92.184 |
| 0.7555555555555555 | 92.184 |
| 0.75625 | 92.184 |
| 0.7569444444444445 | 92.184 |
| 0.7576388888888889 | 87.692 |
| 0.7583333333333333 | 87.692 |
| 0.7590277777777777 | 87.692 |
| 0.7597222222222223 | 87.692 |
| 0.7604166666666666 | 87.692 |
| 0.7611111111111111 | 83.205 |
| 0.7618055555555556 | 83.205 |
| 0.7625000000000001 | 83.205 |
| 0.7631944444444444 | 83.205 |
| 0.7638888888888888 | 83.205 |
| 0.7645833333333334 | 83.205 |
| 0.7652777777777778 | 83.205 |
| 0.7659722222222222 | 78.722 |
| 0.7666666666666666 | 78.722 |
| 0.7673611111111112 | 78.722 |
| 0.7680555555555556 | 78.722 |
| 0.7687499999999999 | 78.722 |
| 0.7694444444444444 | 78.722 |
| 0.7701388888888889 | 74.246 |
| 0.7708333333333334 | 74.246 |
| 0.7715277777777777 | 74.246 |
| 0.7722222222222223 | 74.246 |
| 0.7729166666666667 | 74.246 |
| 0.7736111111111111 | 74.246 |
| 0.7743055555555555 | 74.246 |
| 0.775 | 74.246 |
| 0.7756944444444445 | 74.246 |
| 0.7763888888888889 | 69.775 |
| 0.7770833333333332 | 69.775 |
| 0.7777777777777778 | 69.775 |
| 0.7784722222222222 | 65.31 |
| 0.7791666666666667 | 65.31 |
| 0.779861111111111 | 65.31 |
| 0.7805555555555556 | 65.31 |
| 0.78125 | 65.31 |
| 0.7819444444444444 | 65.31 |
| 0.782638888888889 | 65.31 |
| 0.7833333333333333 | 65.31 |
| 0.7840277777777778 | 65.31 |
| 0.7847222222222222 | 65.31 |
| 0.7854166666666668 | 60.85 |
| 0.7861111111111111 | 60.85 |
| 0.7868055555555555 | 60.85 |
| 0.7875 | 60.85 |
| 0.7881944444444445 | 60.85 |
| 0.7888888888888889 | 56.398 |
| 0.7895833333333333 | 56.398 |
| 0.7902777777777777 | 56.398 |
| 0.7909722222222223 | 56.398 |
| 0.7916666666666666 | 56.398 |
| 0.7923611111111111 | 56.398 |
| 0.7930555555555556 | 56.398 |
| 0.7937500000000001 | 56.398 |
| 0.7944444444444444 | 56.398 |
| 0.7951388888888888 | 56.398 |
| 0.7958333333333334 | 51.951 |
| 0.7965277777777778 | 51.951 |
| 0.7972222222222222 | 51.951 |
| 0.7979166666666666 | 51.951 |
| 0.7986111111111112 | 47.511 |
| 0.7993055555555556 | 47.511 |
| 0.7999999999999999 | 47.511 |
| 0.8006944444444444 | 47.511 |
| 0.8013888888888889 | 47.511 |
| 0.8020833333333334 | 47.511 |
| 0.8027777777777777 | 47.511 |
| 0.8034722222222223 | 47.511 |
| 0.8041666666666667 | 47.511 |
| 0.8048611111111111 | 47.511 |
| 0.8055555555555555 | 43.079 |
| 0.80625 | 43.079 |
| 0.8069444444444445 | 43.079 |
| 0.8076388888888889 | 38.653 |
| 0.8083333333333332 | 38.653 |
| 0.8090277777777778 | 38.653 |
| 0.8097222222222222 | 38.653 |
| 0.8104166666666667 | 38.653 |
| 0.811111111111111 | 38.653 |
| 0.8118055555555556 | 34.234 |
| 0.8125 | 34.234 |
| 0.8131944444444444 | 34.234 |
| 0.813888888888889 | 34.234 |
| 0.8145833333333333 | 29.823 |
| 0.8152777777777778 | 34.234 |
| 0.8159722222222222 | 29.823 |
| 0.8166666666666668 | 29.823 |
| 0.8173611111111111 | 29.823 |
| 0.8180555555555555 | 29.823 |
| 0.81875 | 29.823 |
| 0.8194444444444445 | 29.823 |
| 0.8201388888888889 | 29.823 |
| 0.8208333333333333 | 29.823 |
| 0.8215277777777777 | 29.823 |
| 0.8222222222222223 | 29.823 |
| 0.8229166666666666 | 29.823 |
| 0.8236111111111111 | 29.823 |
| 0.8243055555555556 | 25.419 |
| 0.8250000000000001 | 25.419 |
| 0.8256944444444444 | 25.419 |
| 0.8263888888888888 | 25.419 |
| 0.8270833333333334 | 25.419 |
| 0.8277777777777778 | 25.419 |
| 0.8284722222222222 | 25.419 |
| 0.8291666666666666 | 25.419 |
| 0.8298611111111112 | 21.024 |
| 0.8305555555555556 | 21.024 |
| 0.8312499999999999 | 21.024 |
| 0.8319444444444444 | 21.024 |
| 0.8326388888888889 | 21.024 |
| 0.8333333333333334 | 21.024 |
| 0.8340277777777777 | 21.024 |
| 0.8347222222222223 | 21.024 |
| 0.8354166666666667 | 21.024 |
| 0.8361111111111111 | 21.024 |
| 0.8368055555555555 | 16.636 |
| 0.8375 | 16.636 |
| 0.8381944444444445 | 16.636 |
| 0.8388888888888889 | 16.636 |
| 0.8395833333333332 | 16.636 |
| 0.8402777777777778 | 12.257 |
| 0.8409722222222222 | 12.257 |
| 0.8416666666666667 | 12.257 |
| 0.842361111111111 | 12.257 |
| 0.8430555555555556 | 12.257 |
| 0.84375 | 12.257 |
| 0.8444444444444444 | 12.257 |
| 0.845138888888889 | 7.887 |
| 0.8458333333333333 | 7.887 |
| 0.8465277777777778 | 7.887 |
| 0.8472222222222222 | 7.887 |
| 0.8479166666666668 | 3.525 |
| 0.8486111111111111 | 3.525 |
| 0.8493055555555555 | 3.525 |
| 0.85 | 3.525 |
| 0.8506944444444445 | 3.525 |
| 0.8513888888888889 | 3.525 |
| 0.8520833333333333 | 3.525 |
| 0.8527777777777777 | 3.525 |
| 0.8534722222222223 | 0 |
| 0.8541666666666666 | 3.525 |
| 0.8548611111111111 | 0 |
| 0.8555555555555556 | 0 |
| 0.8562500000000001 | 0 |
| 0.8569444444444444 | 0 |
| 0.8576388888888888 | 0 |
| 0.8583333333333334 | 0 |
| 0.8590277777777778 | 0 |
| 0.8597222222222222 | 0 |
| 0.8604166666666666 | 0 |
| 0.8611111111111112 | 0 |
| 0.8618055555555556 | 0 |
| 0.8624999999999999 | 0 |
| 0.8631944444444444 | 0 |
| 0.8638888888888889 | 0 |
| 0.8645833333333334 | 0 |
| 0.8652777777777777 | 0 |
| 0.8659722222222223 | 0 |
| 0.8666666666666667 | 0 |
| 0.8673611111111111 | 0 |
| 0.8680555555555555 | 0 |
| 0.86875 | 0 |
| 0.8694444444444445 | 0 |
| 0.8701388888888889 | 0 |
| 0.8708333333333332 | 0 |
| 0.8715277777777778 | 0 |
| 0.8722222222222222 | 0 |
| 0.8729166666666667 | 0 |
| 0.873611111111111 | 0 |
| 0.8743055555555556 | 0 |
| 0.875 | 0 |
| 0.8756944444444444 | 0 |
| 0.876388888888889 | 0 |
| 0.8770833333333333 | 0 |
| 0.8777777777777778 | 0 |
| 0.8784722222222222 | 0 |
| 0.8791666666666668 | 0 |
| 0.8798611111111111 | 0 |
| 0.8805555555555555 | 0 |
| 0.88125 | 0 |
| 0.8819444444444445 | 0 |
| 0.8826388888888889 | 0 |
| 0.8833333333333333 | 0 |
| 0.8840277777777777 | 0 |
| 0.8847222222222223 | 0 |
| 0.8854166666666666 | 0 |
| 0.8861111111111111 | 0 |
| 0.8868055555555556 | 0 |
| 0.8875000000000001 | 0 |
| 0.8881944444444444 | 0 |
| 0.8888888888888888 | 0 |
| 0.8895833333333334 | 0 |
| 0.8902777777777778 | 0 |
| 0.8909722222222222 | 0 |
| 0.8916666666666666 | 0 |
| 0.8923611111111112 | 0 |
| 0.8930555555555556 | 0 |
| 0.8937499999999999 | 0 |
| 0.8944444444444444 | 0 |
| 0.8951388888888889 | 0 |
| 0.8958333333333334 | 0 |
| 0.8965277777777777 | 0 |
| 0.8972222222222223 | 0 |
| 0.8979166666666667 | 0 |
| 0.8986111111111111 | 0 |
| 0.8993055555555555 | 0 |
| 0.9 | 0 |
| 0.9006944444444445 | 0 |
| 0.9013888888888889 | 0 |
| 0.9020833333333332 | 0 |
| 0.9027777777777778 | 0 |
| 0.9034722222222222 | 0 |
| 0.9041666666666667 | 0 |
| 0.904861111111111 | 0 |
| 0.9055555555555556 | 0 |
| 0.90625 | 0 |
| 0.9069444444444444 | 0 |
| 0.907638888888889 | 0 |
| 0.9083333333333333 | 0 |
| 0.9090277777777778 | 0 |
| 0.9097222222222222 | 0 |
| 0.9104166666666668 | 0 |
| 0.9111111111111111 | 0 |
| 0.9118055555555555 | 0 |
| 0.9125 | 0 |
| 0.9131944444444445 | 0 |
| 0.9138888888888889 | 0 |
| 0.9145833333333333 | 0 |
| 0.9152777777777777 | 0 |
| 0.9159722222222223 | 0 |
| 0.9166666666666666 | 0 |
| 0.9173611111111111 | 0 |
| 0.9180555555555556 | 0 |
| 0.9187500000000001 | 0 |
| 0.9194444444444444 | 0 |
| 0.9201388888888888 | 0 |
| 0.9208333333333334 | 0 |
| 0.9215277777777778 | 0 |
| 0.9222222222222222 | 0 |
| 0.9229166666666666 | 0 |
| 0.9236111111111112 | 0 |
| 0.9243055555555556 | 0 |
| 0.9249999999999999 | 0 |
| 0.9256944444444444 | 0 |
| 0.9263888888888889 | 0 |
| 0.9270833333333334 | 0 |
| 0.9277777777777777 | 0 |
| 0.9284722222222223 | 0 |
| 0.9291666666666667 | 0 |
| 0.9298611111111111 | 0 |
| 0.9305555555555555 | 0 |
| 0.93125 | 0 |
| 0.9319444444444445 | 0 |
| 0.9326388888888889 | 0 |
| 0.9333333333333332 | 0 |
| 0.9340277777777778 | 0 |
| 0.9347222222222222 | 0 |
| 0.9354166666666667 | 0 |
| 0.936111111111111 | 0 |
| 0.9368055555555556 | 0 |
| 0.9375 | 0 |
| 0.9381944444444444 | 0 |
| 0.938888888888889 | 0 |
| 0.9395833333333333 | 0 |
| 0.9402777777777778 | 0 |
| 0.9409722222222222 | 0 |
| 0.9416666666666668 | 0 |
| 0.9423611111111111 | 0 |
| 0.9430555555555555 | 0 |
| 0.94375 | 0 |
| 0.9444444444444445 | 0 |
| 0.9451388888888889 | 0 |
| 0.9458333333333333 | 0 |
| 0.9465277777777777 | 0 |
| 0.9472222222222223 | 0 |
| 0.9479166666666666 | 0 |
| 0.9486111111111111 | 0 |
| 0.9493055555555556 | 0 |
| 0.9500000000000001 | 0 |
| 0.9506944444444444 | 0 |
| 0.9513888888888888 | 0 |
| 0.9520833333333334 | 0 |
| 0.9527777777777778 | 0 |
| 0.9534722222222222 | 0 |
| 0.9541666666666666 | 0 |
| 0.9548611111111112 | 0 |
| 0.9555555555555556 | 0 |
| 0.9562499999999999 | 0 |
| 0.9569444444444444 | 0 |
| 0.9576388888888889 | 0 |
| 0.9583333333333334 | 0 |
| 0.9590277777777777 | 0 |
| 0.9597222222222223 | 0 |
| 0.9604166666666667 | 0 |
| 0.9611111111111111 | 0 |
| 0.9618055555555555 | 0 |
| 0.9625 | 0 |
| 0.9631944444444445 | 0 |
| 0.9638888888888889 | 0 |
| 0.9645833333333332 | 0 |
| 0.9652777777777778 | 0 |
| 0.9659722222222222 | 0 |
| 0.9666666666666667 | 0 |
| 0.967361111111111 | 0 |
| 0.9680555555555556 | 0 |
| 0.96875 | 0 |
| 0.9694444444444444 | 0 |
| 0.970138888888889 | 0 |
| 0.9708333333333333 | 0 |
| 0.9715277777777778 | 0 |
| 0.9722222222222222 | 0 |
| 0.9729166666666668 | 0 |
| 0.9736111111111111 | 0 |
| 0.9743055555555555 | 0 |
| 0.975 | 0 |
| 0.9756944444444445 | 0 |
| 0.9763888888888889 | 0 |
| 0.9770833333333333 | 0 |
| 0.9777777777777777 | 0 |
| 0.9784722222222223 | 0 |
| 0.9791666666666666 | 0 |
| 0.9798611111111111 | 0 |
| 0.9805555555555556 | 0 |
| 0.9812500000000001 | 0 |
| 0.9819444444444444 | 0 |
| 0.9826388888888888 | 0 |
| 0.9833333333333334 | 0 |
| 0.9840277777777778 | 0 |
| 0.9847222222222222 | 0 |
| 0.9854166666666666 | 0 |
| 0.9861111111111112 | 0 |
| 0.9868055555555556 | 0 |
| 0.9874999999999999 | 0 |
| 0.9881944444444444 | 0 |
| 0.9888888888888889 | 0 |
| 0.9895833333333334 | 0 |
| 0.9902777777777777 | 0 |
| 0.9909722222222223 | 0 |
| 0.9916666666666667 | 0 |
| 0.9923611111111111 | 0 |
| 0.9930555555555555 | 0 |
| 0.99375 | 0 |
| 0.9944444444444445 | 0 |
| 0.9951388888888889 | 0 |
| 0.9958333333333332 | 0 |
| 0.9965277777777778 | 0 |
| 0.9972222222222222 | 0 |
| 0.9979166666666667 | 0 |
| 0.998611111111111 | 0 |
| 0.9993055555555556 | 0 |